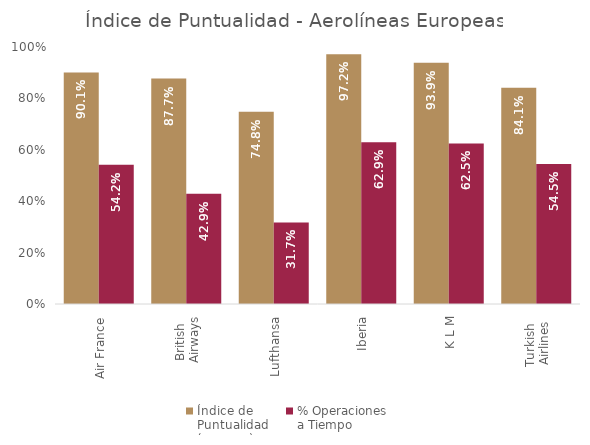
| Category | Índice de 
Puntualidad
(ene-sep) | % Operaciones 
a Tiempo |
|---|---|---|
| Air France | 0.901 | 0.542 |
| British 
Airways | 0.877 | 0.429 |
| Lufthansa | 0.748 | 0.317 |
| Iberia | 0.972 | 0.629 |
| K L M | 0.939 | 0.625 |
| Turkish 
Airlines | 0.841 | 0.545 |